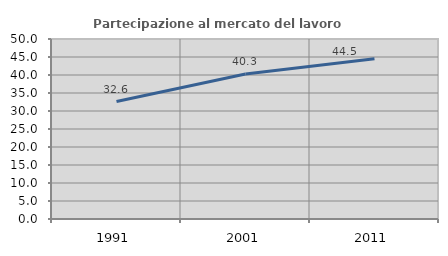
| Category | Partecipazione al mercato del lavoro  femminile |
|---|---|
| 1991.0 | 32.637 |
| 2001.0 | 40.292 |
| 2011.0 | 44.526 |